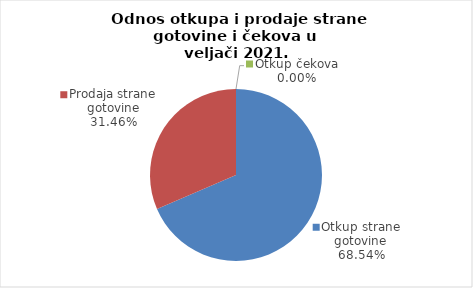
| Category | Series 0 |
|---|---|
| Otkup strane gotovine | 68.541 |
| Prodaja strane gotovine | 31.459 |
| Otkup čekova | 0 |